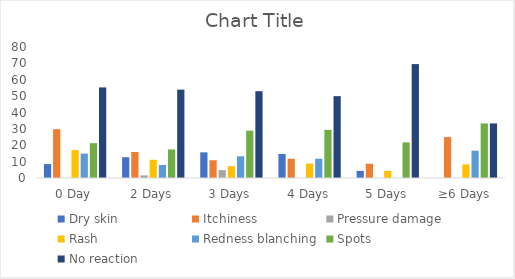
| Category | Dry skin | Itchiness | Pressure damage | Rash | Redness blanching | Spots | No reaction |
|---|---|---|---|---|---|---|---|
| 0 Day | 8.511 | 29.787 | 0 | 17.021 | 14.894 | 21.277 | 55.319 |
| 2 Days | 12.698 | 15.873 | 1.587 | 11.111 | 7.937 | 17.46 | 53.968 |
| 3 Days | 15.663 | 10.843 | 4.819 | 7.229 | 13.253 | 28.916 | 53.012 |
| 4 Days | 14.706 | 11.765 | 0 | 8.824 | 11.765 | 29.412 | 50 |
| 5 Days | 4.348 | 8.696 | 0 | 4.348 | 0 | 21.739 | 69.565 |
| ≥6 Days | 0 | 25 | 0 | 8.333 | 16.667 | 33.333 | 33.333 |